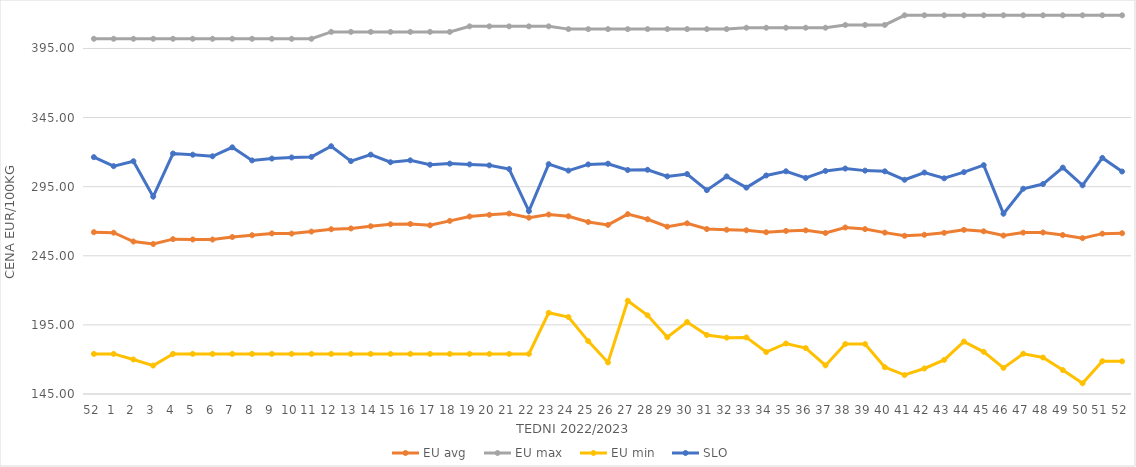
| Category | EU avg | EU max | EU min | SLO |
|---|---|---|---|---|
| 52.0 | 262.088 | 402 | 174 | 316.36 |
| 1.0 | 261.716 | 402 | 174 | 309.84 |
| 2.0 | 255.331 | 402 | 169.983 | 313.4 |
| 3.0 | 253.546 | 402 | 165.574 | 287.81 |
| 4.0 | 257.051 | 402 | 174 | 318.98 |
| 5.0 | 256.808 | 402 | 174 | 318.13 |
| 6.0 | 256.75 | 402 | 174 | 316.99 |
| 7.0 | 258.565 | 402 | 174 | 323.47 |
| 8.0 | 259.872 | 402 | 174 | 314 |
| 9.0 | 261.164 | 402 | 174 | 315.35 |
| 10.0 | 261.06 | 402 | 174 | 316.13 |
| 11.0 | 262.513 | 402 | 174 | 316.55 |
| 12.0 | 264.228 | 407 | 174 | 324.27 |
| 13.0 | 264.768 | 407 | 174 | 313.49 |
| 14.0 | 266.385 | 407 | 174 | 318.17 |
| 15.0 | 267.797 | 407 | 174 | 312.7 |
| 16.0 | 268.021 | 407 | 174 | 314.07 |
| 17.0 | 267.041 | 407 | 174 | 310.87 |
| 18.0 | 270.255 | 407 | 174 | 311.69 |
| 19.0 | 273.406 | 411 | 174 | 311.13 |
| 20.0 | 274.631 | 411 | 174 | 310.42 |
| 21.0 | 275.561 | 411 | 174 | 307.76 |
| 22.0 | 272.542 | 411 | 174 | 277.34 |
| 23.0 | 274.85 | 411 | 203.728 | 311.28 |
| 24.0 | 273.59 | 409 | 200.686 | 306.64 |
| 25.0 | 269.439 | 409 | 183.275 | 311.1 |
| 26.0 | 267.345 | 409 | 167.858 | 311.62 |
| 27.0 | 275.123 | 409 | 212.506 | 307.04 |
| 28.0 | 271.42 | 409 | 201.945 | 307.23 |
| 29.0 | 266.08 | 409 | 186.018 | 302.45 |
| 30.0 | 268.49 | 409 | 197.093 | 304.14 |
| 31.0 | 264.334 | 409 | 187.684 | 292.49 |
| 32.0 | 263.844 | 409 | 185.774 | 302.41 |
| 33.0 | 263.441 | 410 | 185.951 | 294.3 |
| 34.0 | 262.028 | 410 | 175.332 | 303.1 |
| 35.0 | 262.997 | 410 | 181.543 | 306.13 |
| 36.0 | 263.389 | 410 | 178.207 | 301.32 |
| 37.0 | 261.486 | 410 | 165.697 | 306.4 |
| 38.0 | 265.47 | 412 | 181.159 | 308.12 |
| 39.0 | 264.316 | 412 | 181.124 | 306.62 |
| 40.0 | 261.774 | 412 | 164.37 | 306.1 |
| 41.0 | 259.456 | 419 | 158.728 | 300 |
| 42.0 | 260.21 | 419 | 163.464 | 305.24 |
| 43.0 | 261.605 | 419 | 169.66 | 301.07 |
| 44.0 | 263.758 | 419 | 182.925 | 305.52 |
| 45.0 | 262.714 | 419 | 175.524 | 310.58 |
| 46.0 | 259.625 | 419 | 163.882 | 275.46 |
| 47.0 | 261.772 | 419 | 174.136 | 293.51 |
| 48.0 | 261.864 | 419 | 171.4 | 296.9 |
| 49.0 | 260.014 | 419 | 162.336 | 308.8 |
| 50.0 | 257.768 | 419 | 152.762 | 295.97 |
| 51.0 | 261.007 | 419 | 168.739 | 315.82 |
| 52.0 | 261.323 | 419 | 168.659 | 305.97 |